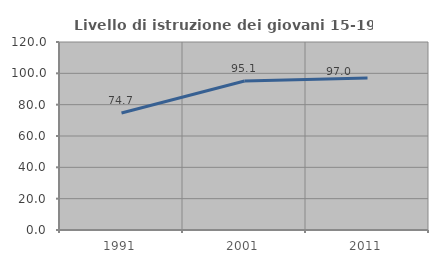
| Category | Livello di istruzione dei giovani 15-19 anni |
|---|---|
| 1991.0 | 74.713 |
| 2001.0 | 95.098 |
| 2011.0 | 97.015 |